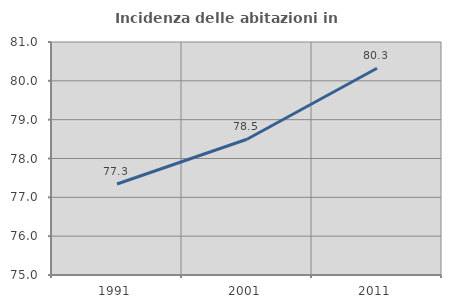
| Category | Incidenza delle abitazioni in proprietà  |
|---|---|
| 1991.0 | 77.344 |
| 2001.0 | 78.495 |
| 2011.0 | 80.323 |